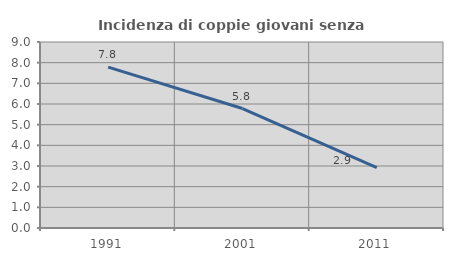
| Category | Incidenza di coppie giovani senza figli |
|---|---|
| 1991.0 | 7.784 |
| 2001.0 | 5.78 |
| 2011.0 | 2.924 |